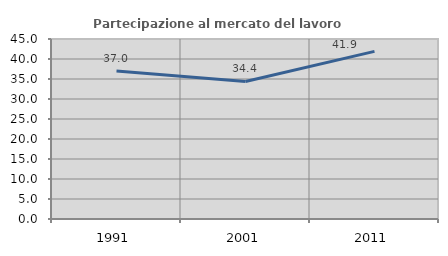
| Category | Partecipazione al mercato del lavoro  femminile |
|---|---|
| 1991.0 | 36.985 |
| 2001.0 | 34.391 |
| 2011.0 | 41.903 |